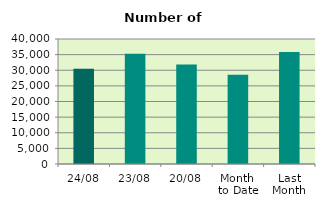
| Category | Series 0 |
|---|---|
| 24/08 | 30504 |
| 23/08 | 35318 |
| 20/08 | 31834 |
| Month 
to Date | 28579.176 |
| Last
Month | 35875.545 |